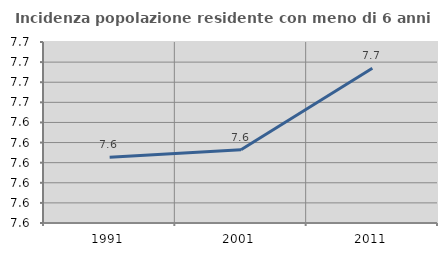
| Category | Incidenza popolazione residente con meno di 6 anni |
|---|---|
| 1991.0 | 7.636 |
| 2001.0 | 7.638 |
| 2011.0 | 7.658 |